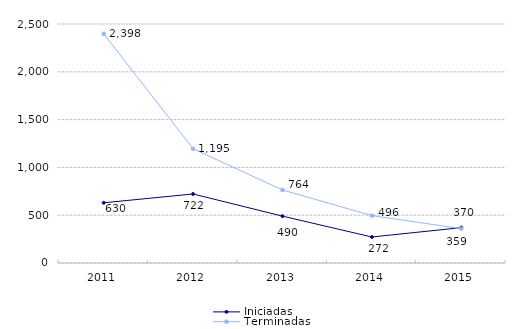
| Category | Iniciadas | Terminadas |
|---|---|---|
| 2011.0 | 630 | 2398 |
| 2012.0 | 722 | 1195 |
| 2013.0 | 490 | 764 |
| 2014.0 | 272 | 496 |
| 2015.0 | 370 | 359 |